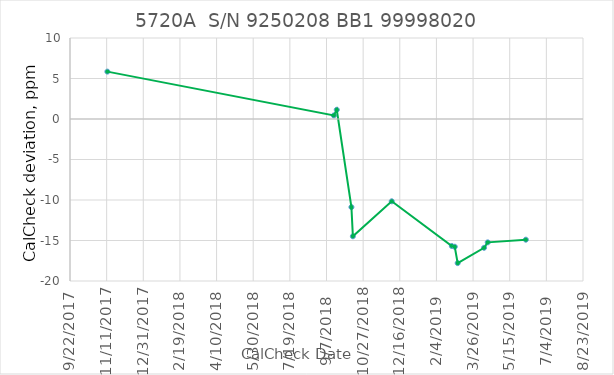
| Category | Series 0 |
|---|---|
| 43051.0 | 5.85 |
| 43360.0 | 0.44 |
| 43364.0 | 1.14 |
| 43384.0 | -10.88 |
| 43386.0 | -14.48 |
| 43439.0 | -10.16 |
| 43521.0 | -15.68 |
| 43525.0 | -15.77 |
| 43529.0 | -17.79 |
| 43565.0 | -15.9 |
| 43570.0 | -15.23 |
| 43622.0 | -14.9 |